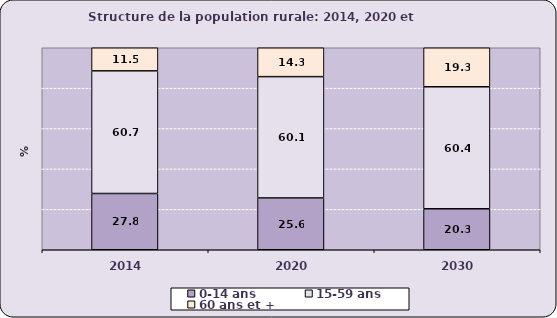
| Category | 0-14 ans  | 15-59 ans | 60 ans et + |
|---|---|---|---|
| 2014.0 | 27.849 | 60.701 | 11.45 |
| 2020.0 | 25.646 | 60.051 | 14.302 |
| 2030.0 | 20.287 | 60.394 | 19.318 |